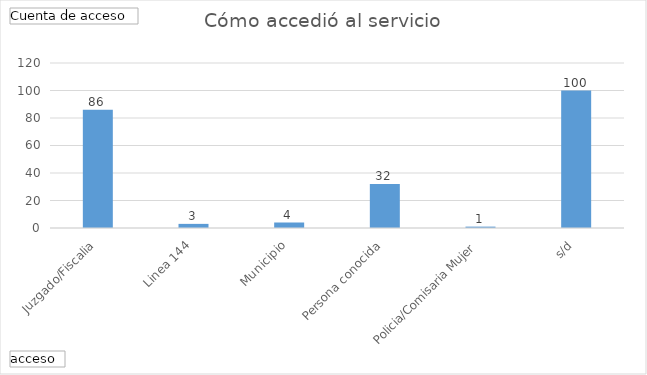
| Category | Total |
|---|---|
| Juzgado/Fiscalia | 86 |
| Linea 144 | 3 |
| Municipio | 4 |
| Persona conocida | 32 |
| Policia/Comisaria Mujer | 1 |
| s/d | 100 |